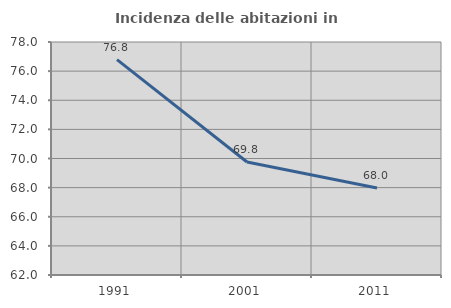
| Category | Incidenza delle abitazioni in proprietà  |
|---|---|
| 1991.0 | 76.793 |
| 2001.0 | 69.758 |
| 2011.0 | 67.969 |